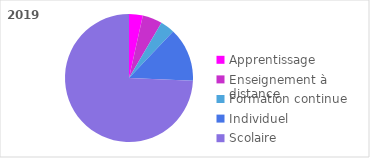
| Category | 2019 |
|---|---|
| Apprentissage | 3.477 |
| Enseignement à distance | 4.997 |
| Formation continue | 3.624 |
| Individuel | 13.589 |
| Scolaire | 74.313 |